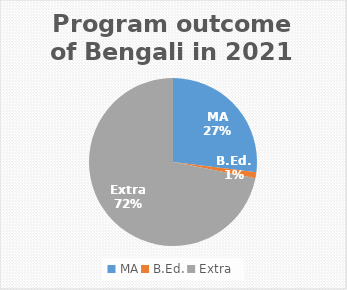
| Category | Series 0 |
|---|---|
| MA | 24 |
| B.Ed. | 1 |
| Extra | 64 |